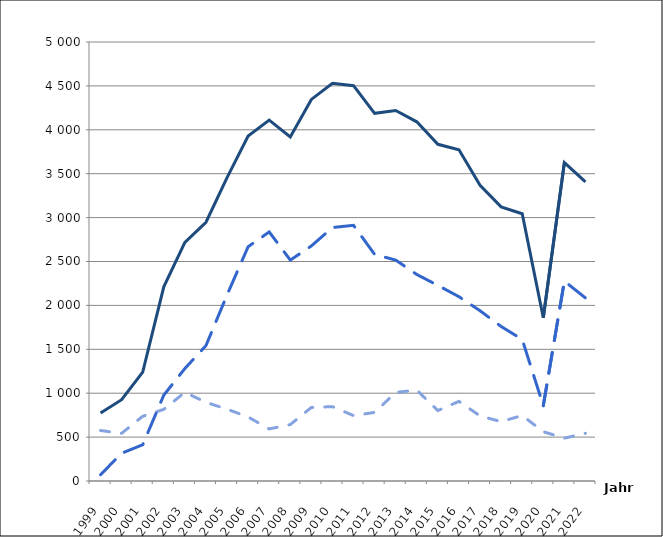
| Category | Series 0 | Series 1 | Series 2 |
|---|---|---|---|
| 1999.0 | 775 | 575 | 71 |
| 2000.0 | 926 | 543 | 316 |
| 2001.0 | 1241 | 737 | 413 |
| 2002.0 | 2211 | 816 | 978 |
| 2003.0 | 2717 | 1010 | 1281 |
| 2004.0 | 2947 | 896 | 1542 |
| 2005.0 | 3455 | 818 | 2119 |
| 2006.0 | 3929 | 729 | 2668 |
| 2007.0 | 4110 | 593 | 2837 |
| 2008.0 | 3919 | 643 | 2516 |
| 2009.0 | 4346 | 838 | 2677 |
| 2010.0 | 4530 | 847 | 2887 |
| 2011.0 | 4503 | 745 | 2912 |
| 2012.0 | 4188 | 781 | 2581 |
| 2013.0 | 4220 | 1009 | 2516 |
| 2014.0 | 4091 | 1035 | 2352 |
| 2015.0 | 3835 | 802 | 2228 |
| 2016.0 | 3772 | 907 | 2099 |
| 2017.0 | 3367 | 741 | 1939 |
| 2018.0 | 3122 | 676 | 1760 |
| 2019.0 | 3044 | 746 | 1612 |
| 2020.0 | 1859 | 561 | 858 |
| 2021.0 | 3626 | 488 | 2276 |
| 2022.0 | 3406 | 543 | 2085 |